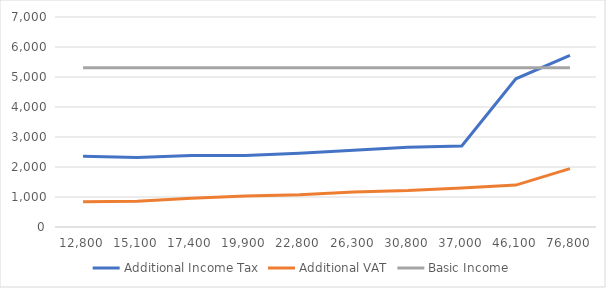
| Category | Additional Income Tax | Additional VAT | Basic Income |
|---|---|---|---|
| 12800.0 | 2360 | 844.48 | 5306.958 |
| 15100.0 | 2320 | 862.16 | 5306.958 |
| 17400.0 | 2380 | 957.32 | 5306.958 |
| 19900.0 | 2380 | 1033.24 | 5306.958 |
| 22800.0 | 2460 | 1073.28 | 5306.958 |
| 26300.0 | 2560 | 1170.52 | 5306.958 |
| 30800.0 | 2660 | 1213.16 | 5306.958 |
| 37000.0 | 2700 | 1298.44 | 5306.958 |
| 46100.0 | 4940 | 1396.2 | 5306.958 |
| 76800.0 | 5720 | 1947.92 | 5306.958 |